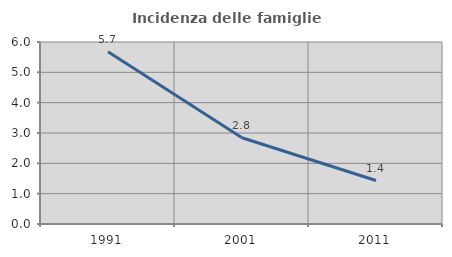
| Category | Incidenza delle famiglie numerose |
|---|---|
| 1991.0 | 5.681 |
| 2001.0 | 2.843 |
| 2011.0 | 1.434 |